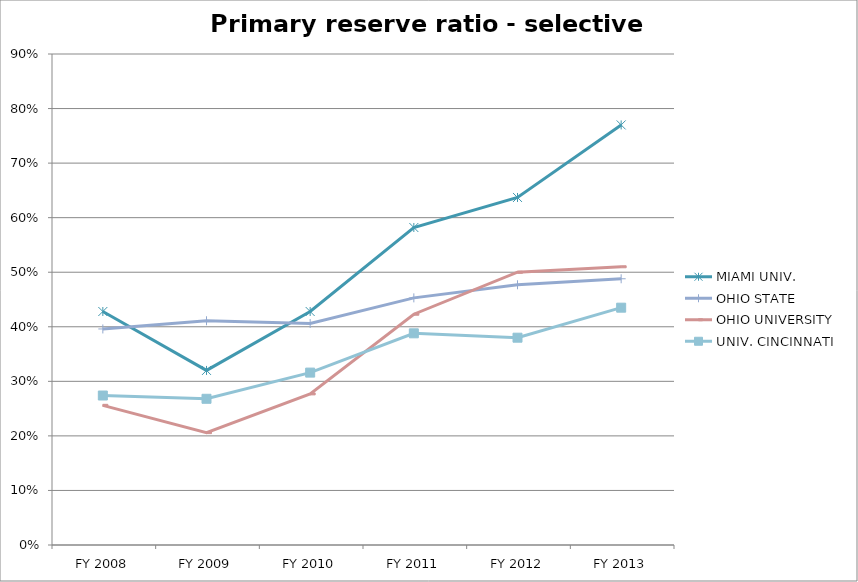
| Category | MIAMI UNIV.  | OHIO STATE  | OHIO UNIVERSITY  | UNIV. CINCINNATI  |
|---|---|---|---|---|
| FY 2013 | 0.77 | 0.488 | 0.51 | 0.435 |
| FY 2012 | 0.637 | 0.477 | 0.5 | 0.38 |
| FY 2011 | 0.582 | 0.453 | 0.423 | 0.388 |
| FY 2010 | 0.428 | 0.406 | 0.277 | 0.316 |
| FY 2009 | 0.32 | 0.411 | 0.206 | 0.268 |
| FY 2008 | 0.428 | 0.396 | 0.256 | 0.274 |